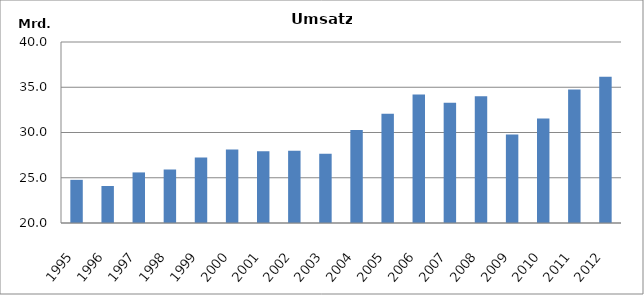
| Category | 1995 1996 1997 1998 1999 2000 2001 2002 2003 2004 2005 2006 2007 2008 2009 2010 2011 2012 |
|---|---|
| 1995 | 24767994 |
| 1996 | 24088396 |
| 1997 | 25588482 |
| 1998 | 25911875 |
| 1999 | 27231996 |
| 2000 | 28121089 |
| 2001 | 27932719 |
| 2002 | 27976228 |
| 2003 | 27652647 |
| 2004 | 30278000 |
| 2005 | 32080721 |
| 2006 | 34189922 |
| 2007 | 33278221 |
| 2008 | 33993013 |
| 2009 | 29783049 |
| 2010 | 31557474.731 |
| 2011 | 34741088 |
| 2012 | 36149532 |